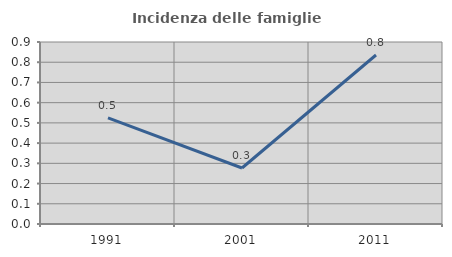
| Category | Incidenza delle famiglie numerose |
|---|---|
| 1991.0 | 0.525 |
| 2001.0 | 0.277 |
| 2011.0 | 0.836 |